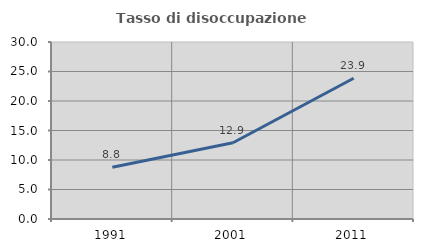
| Category | Tasso di disoccupazione giovanile  |
|---|---|
| 1991.0 | 8.763 |
| 2001.0 | 12.931 |
| 2011.0 | 23.864 |